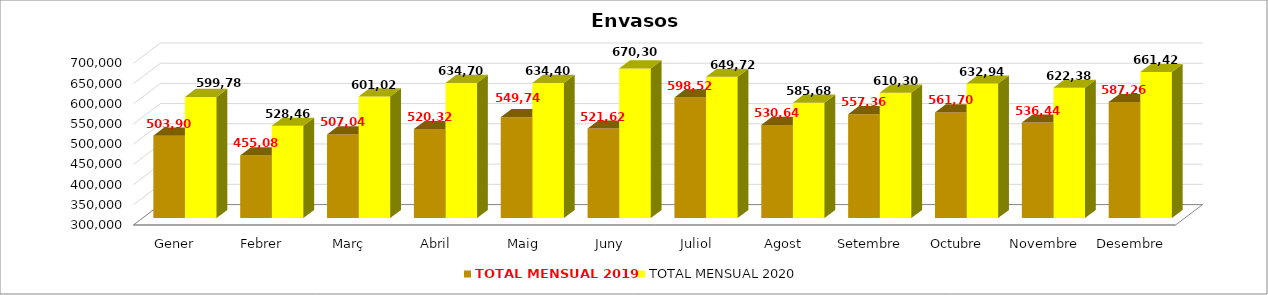
| Category | TOTAL MENSUAL 2019 | TOTAL MENSUAL 2020 |
|---|---|---|
| Gener | 503899.74 | 599779.98 |
| Febrer | 455080.4 | 528459.97 |
| Març | 507040.02 | 601020 |
| Abril | 520320 | 634699.98 |
| Maig | 549739.98 | 634400.02 |
| Juny | 521619.63 | 670300.02 |
| Juliol | 598525.08 | 649720.17 |
| Agost | 530639.99 | 585680.02 |
| Setembre | 557359.99 | 610300.01 |
| Octubre | 561707.26 | 632939.99 |
| Novembre | 536439.858 | 622380.02 |
| Desembre | 587260.01 | 661420.01 |